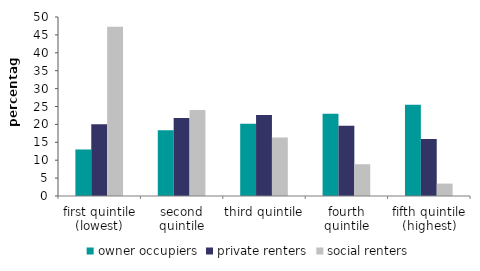
| Category | owner occupiers | private renters | social renters |
|---|---|---|---|
| first quintile (lowest) | 12.995 | 20.031 | 47.288 |
| second quintile | 18.376 | 21.781 | 24.048 |
| third quintile | 20.171 | 22.633 | 16.324 |
| fourth quintile | 23.001 | 19.65 | 8.875 |
| fifth quintile (highest) | 25.456 | 15.905 | 3.465 |